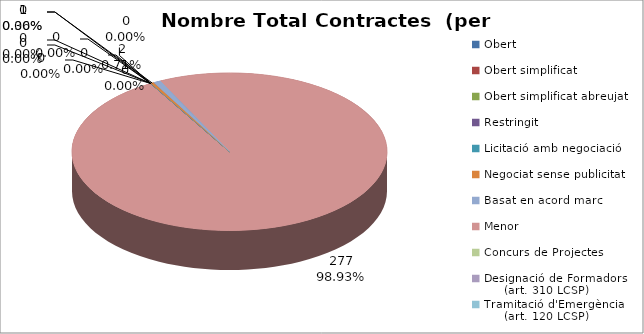
| Category | Nombre Total Contractes |
|---|---|
| Obert | 0 |
| Obert simplificat | 0 |
| Obert simplificat abreujat | 0 |
| Restringit | 0 |
| Licitació amb negociació | 0 |
| Negociat sense publicitat | 1 |
| Basat en acord marc | 2 |
| Menor | 277 |
| Concurs de Projectes | 0 |
| Designació de Formadors
     (art. 310 LCSP) | 0 |
| Tramitació d'Emergència
     (art. 120 LCSP) | 0 |